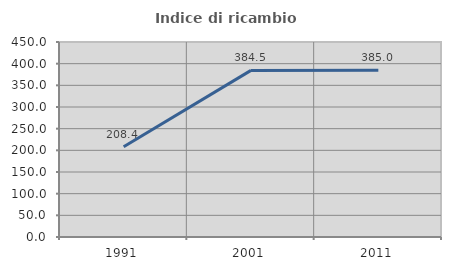
| Category | Indice di ricambio occupazionale  |
|---|---|
| 1991.0 | 208.421 |
| 2001.0 | 384.507 |
| 2011.0 | 385 |